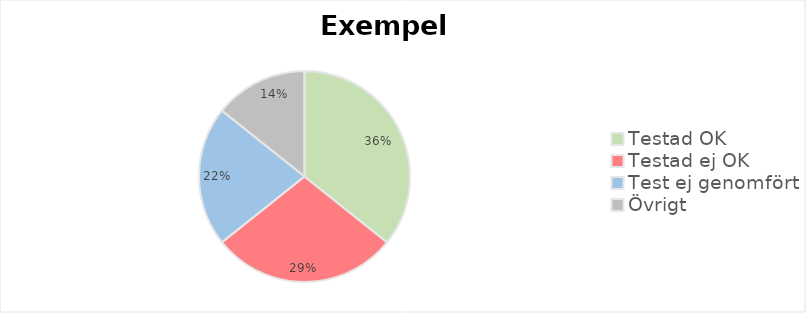
| Category | Series 0 |
|---|---|
| Testad OK | 5 |
| Testad ej OK | 4 |
| Test ej genomfört | 3 |
| Övrigt | 2 |